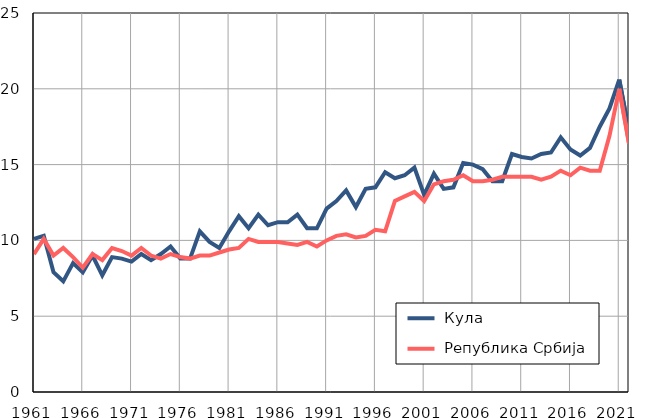
| Category |  Кула |  Република Србија |
|---|---|---|
| 1961.0 | 10.1 | 9.1 |
| 1962.0 | 10.3 | 10.1 |
| 1963.0 | 7.9 | 9 |
| 1964.0 | 7.3 | 9.5 |
| 1965.0 | 8.5 | 8.9 |
| 1966.0 | 7.9 | 8.2 |
| 1967.0 | 9 | 9.1 |
| 1968.0 | 7.7 | 8.7 |
| 1969.0 | 8.9 | 9.5 |
| 1970.0 | 8.8 | 9.3 |
| 1971.0 | 8.6 | 9 |
| 1972.0 | 9.1 | 9.5 |
| 1973.0 | 8.7 | 9 |
| 1974.0 | 9.1 | 8.8 |
| 1975.0 | 9.6 | 9.1 |
| 1976.0 | 8.8 | 8.9 |
| 1977.0 | 8.8 | 8.8 |
| 1978.0 | 10.6 | 9 |
| 1979.0 | 9.9 | 9 |
| 1980.0 | 9.5 | 9.2 |
| 1981.0 | 10.6 | 9.4 |
| 1982.0 | 11.6 | 9.5 |
| 1983.0 | 10.8 | 10.1 |
| 1984.0 | 11.7 | 9.9 |
| 1985.0 | 11 | 9.9 |
| 1986.0 | 11.2 | 9.9 |
| 1987.0 | 11.2 | 9.8 |
| 1988.0 | 11.7 | 9.7 |
| 1989.0 | 10.8 | 9.9 |
| 1990.0 | 10.8 | 9.6 |
| 1991.0 | 12.1 | 10 |
| 1992.0 | 12.6 | 10.3 |
| 1993.0 | 13.3 | 10.4 |
| 1994.0 | 12.2 | 10.2 |
| 1995.0 | 13.4 | 10.3 |
| 1996.0 | 13.5 | 10.7 |
| 1997.0 | 14.5 | 10.6 |
| 1998.0 | 14.1 | 12.6 |
| 1999.0 | 14.3 | 12.9 |
| 2000.0 | 14.8 | 13.2 |
| 2001.0 | 13 | 12.6 |
| 2002.0 | 14.4 | 13.7 |
| 2003.0 | 13.4 | 13.9 |
| 2004.0 | 13.5 | 14 |
| 2005.0 | 15.1 | 14.3 |
| 2006.0 | 15 | 13.9 |
| 2007.0 | 14.7 | 13.9 |
| 2008.0 | 13.9 | 14 |
| 2009.0 | 13.9 | 14.2 |
| 2010.0 | 15.7 | 14.2 |
| 2011.0 | 15.5 | 14.2 |
| 2012.0 | 15.4 | 14.2 |
| 2013.0 | 15.7 | 14 |
| 2014.0 | 15.8 | 14.2 |
| 2015.0 | 16.8 | 14.6 |
| 2016.0 | 16 | 14.3 |
| 2017.0 | 15.6 | 14.8 |
| 2018.0 | 16.1 | 14.6 |
| 2019.0 | 17.5 | 14.6 |
| 2020.0 | 18.7 | 16.9 |
| 2021.0 | 20.6 | 20 |
| 2022.0 | 17.2 | 16.4 |